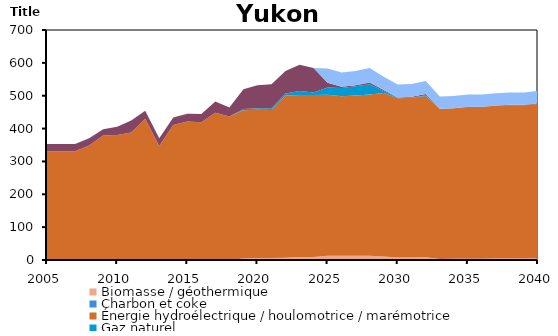
| Category | Biomasse / géothermique | Charbon et coke | Énergie hydroélectrique / houlomotrice / marémotrice | Gaz naturel | Pétrole | Solaire | Uranium | Éolien |
|---|---|---|---|---|---|---|---|---|
| 2005.0 | 0 | 0 | 330.633 | 0 | 22.094 | 0 | 0 | 0.407 |
| 2006.0 | 0 | 0 | 330.633 | 0 | 22.094 | 0 | 0 | 0.407 |
| 2007.0 | 0 | 0 | 330.633 | 0 | 22.094 | 0 | 0 | 0.407 |
| 2008.0 | 0 | 0 | 348.294 | 0 | 22.331 | 0 | 0 | 0.437 |
| 2009.0 | 0 | 0 | 379.056 | 0 | 18.542 | 0 | 0 | 0.228 |
| 2010.0 | 0 | 0 | 380.431 | 0 | 24.783 | 0 | 0 | 0.085 |
| 2011.0 | 0 | 0 | 388.067 | 0 | 36.868 | 0 | 0 | 0.402 |
| 2012.0 | 0 | 0 | 430.194 | 0 | 24.365 | 0 | 0 | 0.445 |
| 2013.0 | 0 | 0 | 347.187 | 0 | 23.291 | 0 | 0 | 0.277 |
| 2014.0 | 0 | 0 | 410.668 | 0 | 23 | 0 | 0 | 0.334 |
| 2015.0 | 0 | 0 | 421.696 | 0 | 23.783 | 0 | 0 | 0.65 |
| 2016.0 | 0 | 0 | 419.461 | 0 | 24.698 | 0 | 0 | 0.509 |
| 2017.0 | 0 | 0 | 448.151 | 0 | 33.966 | 0 | 0 | 0.033 |
| 2018.0 | 0 | 0 | 437.013 | 0 | 27.238 | 0 | 0 | 0.032 |
| 2019.0 | 4.625 | 0 | 451.464 | 3.584 | 60.295 | 0 | 0 | 0.033 |
| 2020.0 | 6.304 | 0 | 450.81 | 5.02 | 69.881 | 0 | 0 | 0.033 |
| 2021.0 | 6.367 | 0 | 450.264 | 5.468 | 72.975 | 0 | 0 | 0.033 |
| 2022.0 | 7.209 | 0 | 493.44 | 5.893 | 68.876 | 0 | 0 | 0.033 |
| 2023.0 | 9.11 | 0 | 493.085 | 11.991 | 80.019 | 0 | 0 | 0.033 |
| 2024.0 | 9.11 | 0 | 492.81 | 7.574 | 74.684 | 0 | 0 | 0.033 |
| 2025.0 | 12.599 | 0 | 490.527 | 21.775 | 14.347 | 0 | 0 | 43.646 |
| 2026.0 | 12.564 | 0 | 485.505 | 25.772 | 3.329 | 0 | 0 | 43.204 |
| 2027.0 | 12.584 | 0 | 488.037 | 28.027 | 3.355 | 0 | 0 | 43.449 |
| 2028.0 | 12.892 | 0 | 490.451 | 31.359 | 5.832 | 0 | 0 | 43.677 |
| 2029.0 | 10.311 | 0 | 498.11 | 5.753 | 3.329 | 0 | 0 | 40.384 |
| 2030.0 | 7.569 | 0 | 485.062 | 0.895 | 1.405 | 0 | 0 | 39.223 |
| 2031.0 | 7.945 | 0 | 485.946 | 1.021 | 1.615 | 0 | 0 | 39.288 |
| 2032.0 | 8.538 | 0 | 490.933 | 2.273 | 3.297 | 0 | 0 | 39.752 |
| 2033.0 | 3.345 | 0 | 456.653 | 0 | 0.499 | 0 | 0 | 36.773 |
| 2034.0 | 3.542 | 0 | 457.977 | 0 | 0.587 | 0 | 0 | 36.875 |
| 2035.0 | 3.794 | 0 | 461.55 | 0 | 0.82 | 0 | 0 | 37.202 |
| 2036.0 | 4.026 | 0 | 461.623 | 0 | 0.771 | 0 | 0 | 37.208 |
| 2037.0 | 4.238 | 0 | 465.016 | 0 | 1.13 | 0 | 0 | 37.488 |
| 2038.0 | 4.75 | 0 | 466.069 | 0 | 1.332 | 0 | 0 | 37.56 |
| 2039.0 | 4.752 | 0 | 466.139 | 0.01 | 1.332 | 0 | 0 | 37.565 |
| 2040.0 | 5.742 | 0 | 469.566 | 0.048 | 1.332 | 0 | 0 | 37.893 |